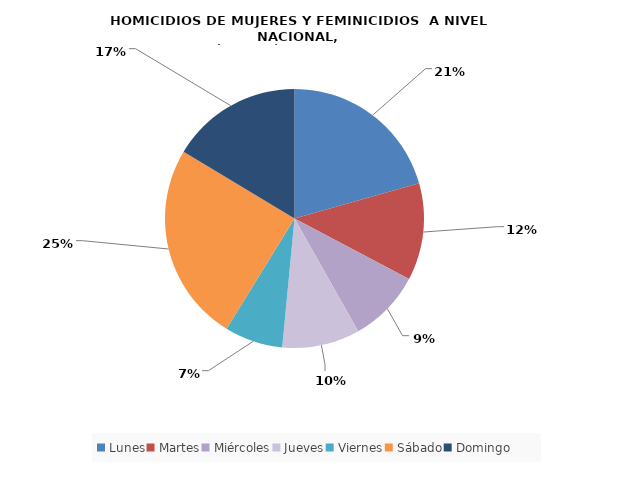
| Category | Lunes |
|---|---|
| Lunes | 34 |
| Martes | 20 |
| Miércoles | 15 |
| Jueves | 16 |
| Viernes | 12 |
| Sábado | 41 |
| Domingo | 27 |